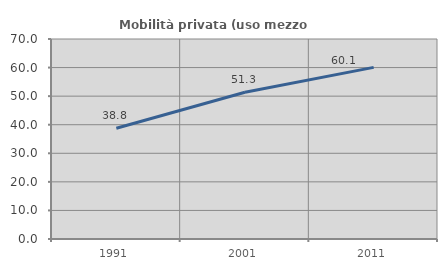
| Category | Mobilità privata (uso mezzo privato) |
|---|---|
| 1991.0 | 38.757 |
| 2001.0 | 51.342 |
| 2011.0 | 60.069 |